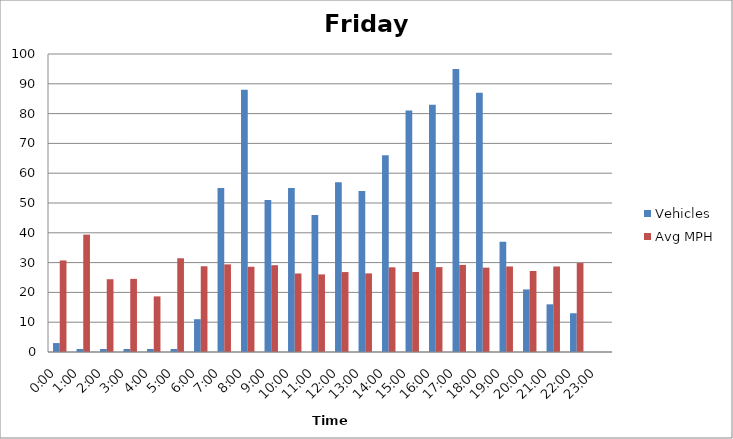
| Category | Vehicles | Avg MPH |
|---|---|---|
| 0:00 | 3 | 30.73 |
| 1:00 | 1 | 39.39 |
| 2:00 | 1 | 24.42 |
| 3:00 | 1 | 24.54 |
| 4:00 | 1 | 18.66 |
| 5:00 | 1 | 31.45 |
| 6:00 | 11 | 28.77 |
| 7:00 | 55 | 29.4 |
| 8:00 | 88 | 28.6 |
| 9:00 | 51 | 29.13 |
| 10:00 | 55 | 26.35 |
| 11:00 | 46 | 26.04 |
| 12:00 | 57 | 26.82 |
| 13:00 | 54 | 26.38 |
| 14:00 | 66 | 28.42 |
| 15:00 | 81 | 26.86 |
| 16:00 | 83 | 28.48 |
| 17:00 | 95 | 29.23 |
| 18:00 | 87 | 28.31 |
| 19:00 | 37 | 28.7 |
| 20:00 | 21 | 27.19 |
| 21:00 | 16 | 28.69 |
| 22:00 | 13 | 29.85 |
| 23:00 | 0 | 0 |